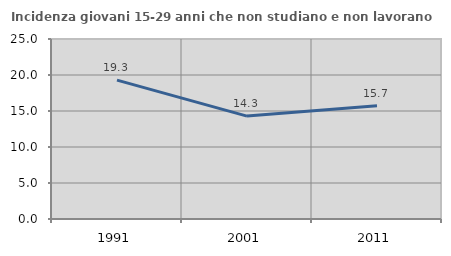
| Category | Incidenza giovani 15-29 anni che non studiano e non lavorano  |
|---|---|
| 1991.0 | 19.284 |
| 2001.0 | 14.294 |
| 2011.0 | 15.719 |